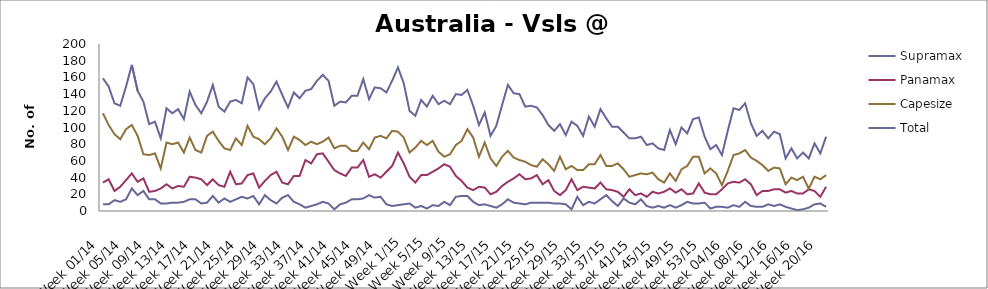
| Category | Supramax | Panamax | Capesize | Total |
|---|---|---|---|---|
| Week 01/14 | 8 | 34 | 117 | 159 |
| Week 02/14 | 8 | 38 | 103 | 149 |
| Week 03/14 | 13 | 24 | 92 | 129 |
| Week 04/14 | 11 | 29 | 86 | 126 |
| Week 05/14 | 14 | 37 | 98 | 149 |
| Week 06/14 | 27 | 45 | 103 | 175 |
| Week 07/14 | 19 | 35 | 90 | 144 |
| Week 08/14 | 24 | 39 | 68 | 131 |
| Week 09/14 | 14 | 23 | 67 | 104 |
| Week 10/14 | 14 | 24 | 69 | 107 |
| Week 11/14 | 9 | 27 | 51 | 87 |
| Week 12/14 | 9 | 32 | 82 | 123 |
| Week 13/14 | 10 | 27 | 80 | 117 |
| Week 14/14 | 10 | 30 | 82 | 122 |
| Week 15/14 | 11 | 29 | 70 | 110 |
| Week 16/14 | 14 | 41 | 88 | 143 |
| Week 17/14 | 14 | 40 | 73 | 127 |
| Week 18/14 | 9 | 38 | 70 | 117 |
| Week 19/14 | 10 | 31 | 90 | 131 |
| Week 20/14 | 18 | 38 | 95 | 151 |
| Week 21/14 | 10 | 31 | 84 | 125 |
| Week 22/14 | 15 | 29 | 75 | 119 |
| Week 23/14 | 11 | 47 | 73 | 131 |
| Week 24/14 | 14 | 32 | 87 | 133 |
| Week 25/14 | 17 | 33 | 79 | 129 |
| Week 26/14 | 15 | 43 | 102 | 160 |
| Week 27/14 | 18 | 45 | 89 | 152 |
| Week 28/14 | 8 | 28 | 86 | 122 |
| Week 29/14 | 19 | 36 | 80 | 135 |
| Week 30/14 | 13 | 43 | 87 | 143 |
| Week 31/14 | 9 | 47 | 99 | 155 |
| Week 32/14 | 16 | 34 | 89 | 139 |
| Week 33/14 | 19 | 32 | 73 | 124 |
| Week 34/14 | 11 | 42 | 89 | 142 |
| Week 35/14 | 8 | 42 | 85 | 135 |
| Week 36/14 | 4 | 61 | 79 | 144 |
| Week 37/14 | 6 | 57 | 83 | 146 |
| Week 38/14 | 8 | 68 | 80 | 156 |
| Week 39/14 | 11 | 69 | 83 | 163 |
| Week 40/14 | 9 | 59 | 88 | 156 |
| Week 41/14 | 2 | 49 | 75 | 126 |
| Week 42/14 | 8 | 45 | 78 | 131 |
| Week 43/14 | 10 | 42 | 78 | 130 |
| Week 44/14 | 14 | 52 | 72 | 138 |
| Week 45/14 | 14 | 52 | 72 | 138 |
| Week 46/14 | 15 | 61 | 82 | 158 |
| Week 47/14 | 19 | 41 | 74 | 134 |
| Week 48/14 | 16 | 44 | 88 | 148 |
| Week 49/14 | 17 | 40 | 90 | 147 |
| Week 50/14 | 8 | 47 | 87 | 142 |
| Week 51/14 | 6 | 54 | 96 | 156 |
| Week 52/14 | 7 | 70 | 95 | 172 |
| Week 1/15 | 8 | 57 | 88 | 153 |
| Week 2/15 | 9 | 41 | 70 | 120 |
| Week 3/15 | 4 | 34 | 76 | 114 |
| Week 4/15 | 6 | 43 | 84 | 133 |
| Week 5/15 | 3 | 43 | 79 | 125 |
| Week 6/15 | 7 | 47 | 84 | 138 |
| Week 7/15 | 6 | 51 | 71 | 128 |
| Week 8/15 | 11 | 56 | 65 | 132 |
| Week 9/15 | 7 | 53 | 68 | 128 |
| Week 10/15 | 17 | 42 | 79 | 140 |
| Week 11/15 | 18 | 36 | 84 | 139 |
| Week 12/15 | 18 | 28 | 98 | 145 |
| Week 13/15 | 11 | 25 | 88 | 126 |
| Week 14/15 | 7 | 29 | 65 | 103 |
| Week 15/15 | 8 | 28 | 82 | 118 |
| Week 16/15 | 6 | 20 | 63 | 90 |
| Week 17/15 | 4 | 23 | 54 | 102 |
| Week 18/15 | 8 | 30 | 65 | 127 |
| Week 19/15 | 14 | 35 | 72 | 151 |
| Week 20/15 | 10 | 39 | 64 | 141 |
| Week 21/15 | 9 | 44 | 61 | 140 |
| Week 22/15 | 8 | 38 | 59 | 125 |
| Week 23/15 | 10 | 39 | 55 | 126 |
| Week 24/15 | 10 | 43 | 53 | 124 |
| Week 25/15 | 10 | 32 | 62 | 115 |
| Week 26/15 | 10 | 37 | 56 | 103 |
| Week 27/15 | 9 | 24 | 48 | 96 |
| Week 28/15 | 9 | 19 | 65 | 104 |
| Week 29/15 | 8 | 25 | 50 | 91 |
| Week 30/15 | 2 | 38 | 54 | 107 |
| Week 31/15 | 17 | 25 | 49 | 102 |
| Week 32/15 | 7 | 29 | 49 | 90 |
| Week 33/15 | 11 | 28 | 56 | 113 |
| Week 34/15 | 9 | 27 | 56 | 101 |
| Week 35/15 | 14 | 34 | 67 | 122 |
| Week 36/15 | 19 | 26 | 54 | 111 |
| Week 37/15 | 12 | 25 | 54 | 101 |
| Week 38/15 | 6 | 23 | 57 | 101 |
| Week 39/15 | 15 | 17 | 50 | 94 |
| Week 40/15 | 10 | 26 | 41 | 87 |
| Week 41/15 | 8 | 19 | 43 | 87 |
| Week 42/15 | 14 | 21 | 45 | 89 |
| Week 43/15 | 6 | 17 | 44 | 79 |
| Week 44/15 | 4 | 23 | 46 | 81 |
| Week 45/15 | 6 | 21 | 38 | 75 |
| Week 46/15 | 4 | 23 | 34 | 73 |
| Week 47/15 | 7 | 27 | 45 | 97 |
| Week 48/15 | 4 | 22 | 36 | 80 |
| Week 49/15 | 7 | 26 | 50 | 100 |
| Week 50/15 | 11 | 20 | 54 | 93 |
| Week 51/15 | 9 | 21 | 65 | 110 |
| Week 52/15 | 9 | 33 | 65 | 112 |
| Week 53/15 | 10 | 22 | 45 | 89 |
| Week 01/16 | 3 | 20 | 51 | 74 |
| Week 02/16 | 5 | 20 | 45 | 79 |
| Week 03/16 | 5 | 26 | 31 | 67 |
| Week 04/16 | 4 | 33 | 48 | 96 |
| Week 05/16 | 7 | 35 | 67 | 123 |
| Week 06/16 | 5 | 34 | 69 | 121 |
| Week 07/16 | 11 | 38 | 73 | 129 |
| Week 08/16 | 6 | 32 | 64 | 105 |
| Week 09/16 | 5 | 19 | 60 | 90 |
| Week 10/16 | 5 | 24 | 55 | 96 |
| Week 11/16 | 8 | 24 | 48 | 87 |
| Week 12/16 | 6 | 26 | 52 | 95 |
| Week 13/16 | 8 | 26 | 51 | 92 |
| Week 14/16 | 5 | 22 | 32 | 63 |
| Week 15/16 | 3 | 24 | 40 | 75 |
| Week 16/16 | 1 | 21 | 37 | 63 |
| Week 17/16 | 2 | 21 | 41 | 70 |
| Week 18/16 | 4 | 26 | 27 | 63 |
| Week 19/16 | 8 | 24 | 41 | 81 |
| Week 20/16 | 9 | 17 | 38 | 69 |
| Week 21/16 | 5 | 29 | 43 | 89 |